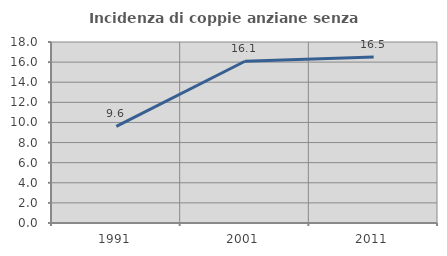
| Category | Incidenza di coppie anziane senza figli  |
|---|---|
| 1991.0 | 9.607 |
| 2001.0 | 16.087 |
| 2011.0 | 16.52 |